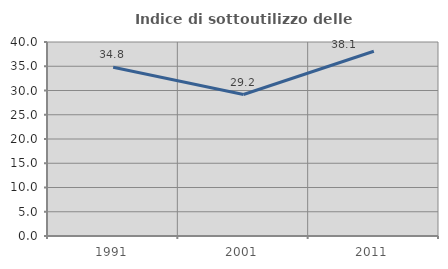
| Category | Indice di sottoutilizzo delle abitazioni  |
|---|---|
| 1991.0 | 34.783 |
| 2001.0 | 29.167 |
| 2011.0 | 38.095 |